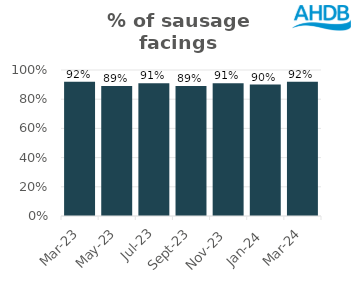
| Category | Sausage |
|---|---|
| 2023-03-01 | 0.92 |
| 2023-05-01 | 0.89 |
| 2023-07-01 | 0.91 |
| 2023-09-01 | 0.89 |
| 2023-11-01 | 0.91 |
| 2024-01-01 | 0.9 |
| 2024-03-01 | 0.92 |